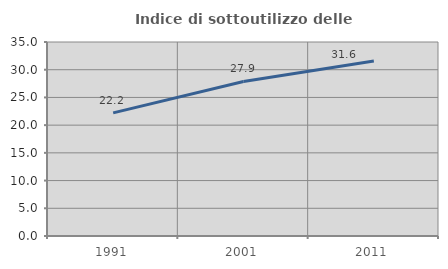
| Category | Indice di sottoutilizzo delle abitazioni  |
|---|---|
| 1991.0 | 22.221 |
| 2001.0 | 27.885 |
| 2011.0 | 31.564 |